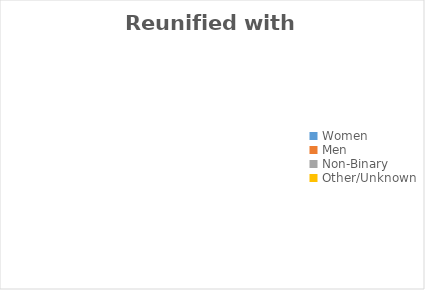
| Category | Reunified with child(ren) |
|---|---|
| Women | 0 |
| Men | 0 |
| Non-Binary | 0 |
| Other/Unknown | 0 |